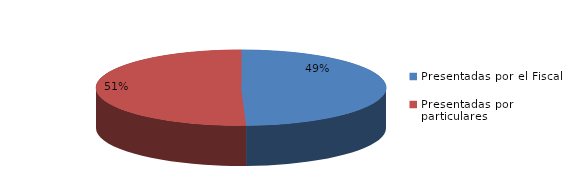
| Category | Series 0 |
|---|---|
| Presentadas por el Fiscal | 134 |
| Presentadas por particulares | 137 |